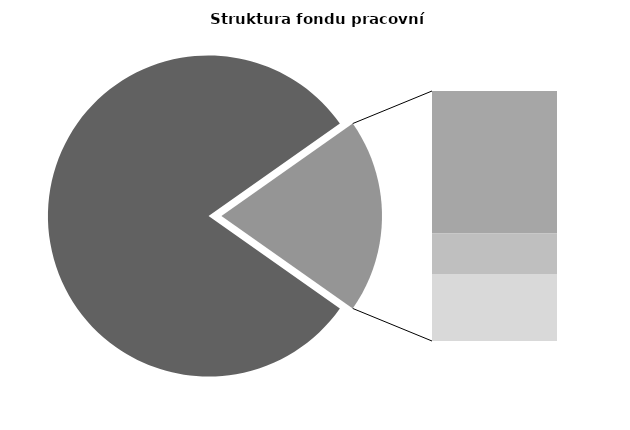
| Category | Series 0 |
|---|---|
| Průměrná měsíční odpracovaná doba bez přesčasu | 138.744 |
| Dovolená | 19.202 |
| Nemoc | 5.429 |
| Jiné | 9.036 |